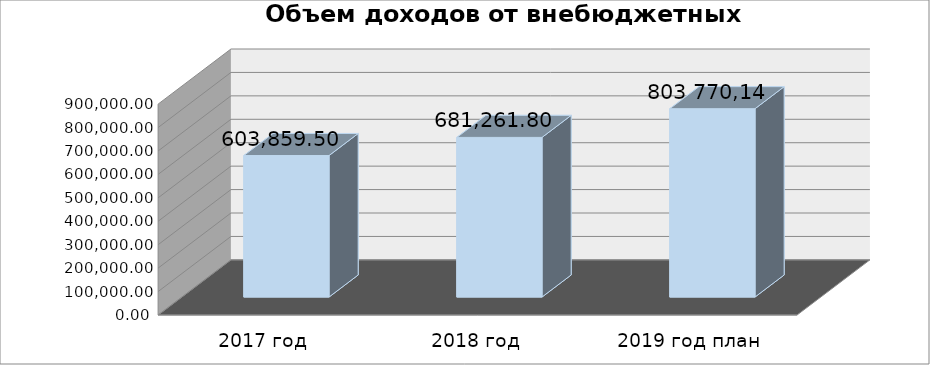
| Category | Series 0 |
|---|---|
| 2017 год | 603859.5 |
| 2018 год | 681261.8 |
| 2019 год план | 803770.14 |